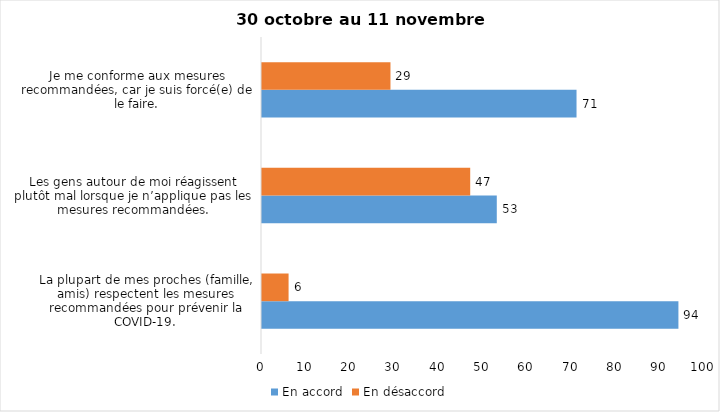
| Category | En accord | En désaccord |
|---|---|---|
| La plupart de mes proches (famille, amis) respectent les mesures recommandées pour prévenir la COVID-19. | 94 | 6 |
| Les gens autour de moi réagissent plutôt mal lorsque je n’applique pas les mesures recommandées. | 53 | 47 |
| Je me conforme aux mesures recommandées, car je suis forcé(e) de le faire. | 71 | 29 |